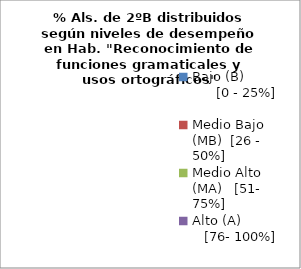
| Category | Series 0 |
|---|---|
| Bajo (B)                 [0 - 25%] | 0 |
| Medio Bajo (MB)  [26 - 50%] | 0 |
| Medio Alto (MA)   [51- 75%] | 0 |
| Alto (A)              [76- 100%] | 0 |